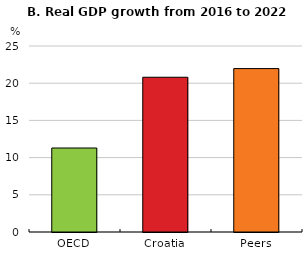
| Category | 2016-22 |
|---|---|
| OECD | 11.289 |
| Croatia | 20.8 |
| Peers | 21.963 |